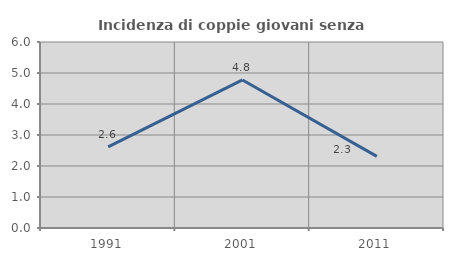
| Category | Incidenza di coppie giovani senza figli |
|---|---|
| 1991.0 | 2.618 |
| 2001.0 | 4.776 |
| 2011.0 | 2.31 |